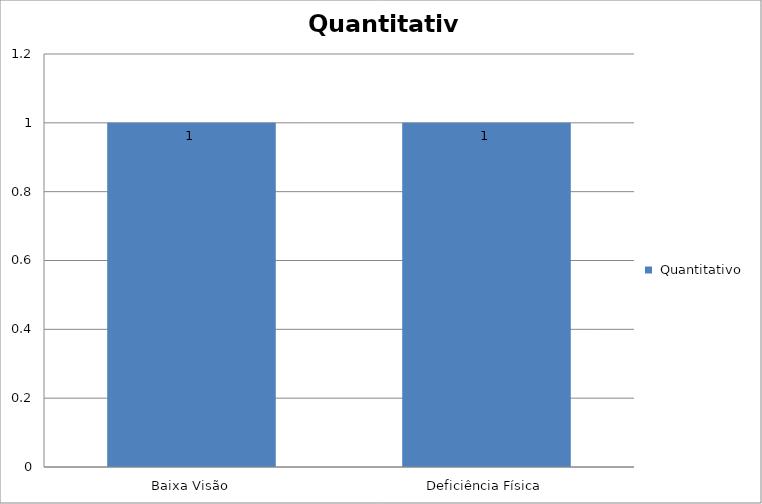
| Category |  Quantitativo |
|---|---|
| Baixa Visão | 1 |
| Deficiência Física | 1 |